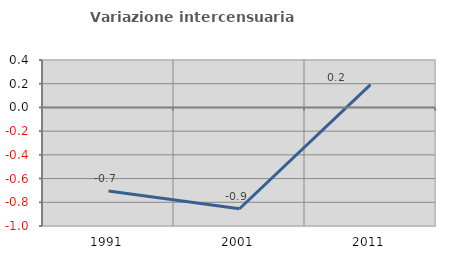
| Category | Variazione intercensuaria annua |
|---|---|
| 1991.0 | -0.705 |
| 2001.0 | -0.854 |
| 2011.0 | 0.192 |